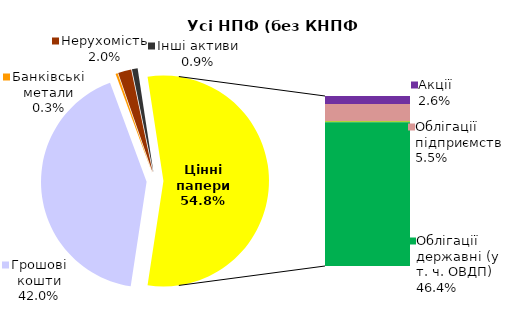
| Category | Усі НПФ (без КНПФ НБУ) |
|---|---|
| Грошові кошти | 650.537 |
| Банківські метали | 5.006 |
| Нерухомість | 31.489 |
| Інші активи | 13.492 |
| Акції | 40.04 |
| Облігації підприємств | 85.788 |
| Муніципальні облігації | 5.231 |
| Облігації державні (у т. ч. ОВДП) | 718.69 |